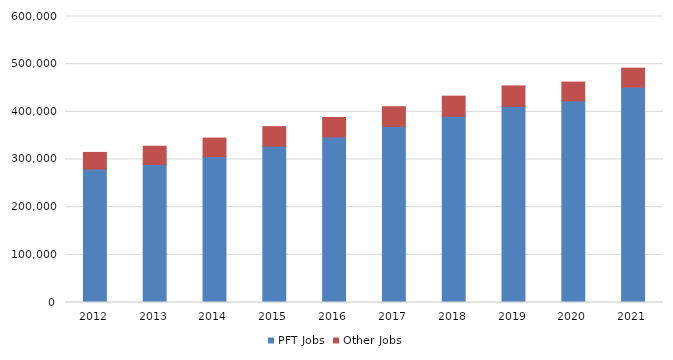
| Category | PFT Jobs | Other Jobs |
|---|---|---|
| 2012.0 | 279998 | 34835 |
| 2013.0 | 289585 | 38222 |
| 2014.0 | 305957 | 38999 |
| 2015.0 | 327938 | 41009 |
| 2016.0 | 347400 | 40770 |
| 2017.0 | 369467 | 41247 |
| 2018.0 | 390689 | 42191 |
| 2019.0 | 411533 | 42876 |
| 2020.0 | 423036 | 39401 |
| 2021.0 | 451945 | 39693 |